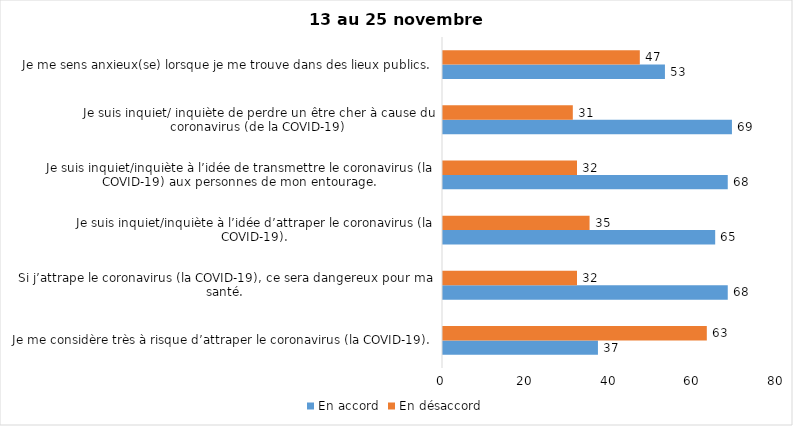
| Category | En accord | En désaccord |
|---|---|---|
| Je me considère très à risque d’attraper le coronavirus (la COVID-19). | 37 | 63 |
| Si j’attrape le coronavirus (la COVID-19), ce sera dangereux pour ma santé. | 68 | 32 |
| Je suis inquiet/inquiète à l’idée d’attraper le coronavirus (la COVID-19). | 65 | 35 |
| Je suis inquiet/inquiète à l’idée de transmettre le coronavirus (la COVID-19) aux personnes de mon entourage. | 68 | 32 |
| Je suis inquiet/ inquiète de perdre un être cher à cause du coronavirus (de la COVID-19) | 69 | 31 |
| Je me sens anxieux(se) lorsque je me trouve dans des lieux publics. | 53 | 47 |